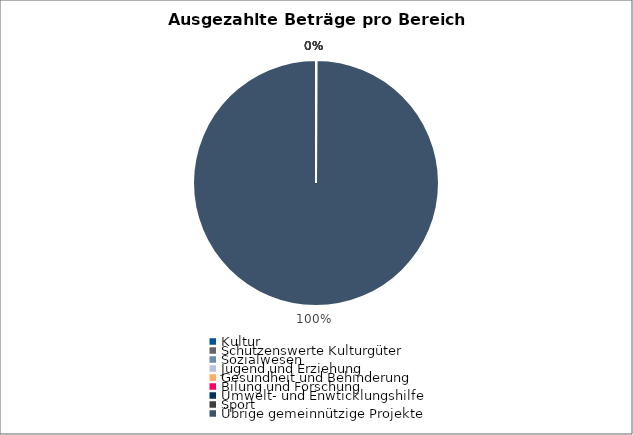
| Category | Series 0 |
|---|---|
| Kultur | 0 |
| Schützenswerte Kulturgüter | 0 |
| Sozialwesen | 0 |
| Jugend und Erziehung | 0 |
| Gesundheit und Behinderung | 0 |
| Bilung und Forschung | 0 |
| Umwelt- und Enwticklungshilfe | 0 |
| Sport | 0 |
| Übrige gemeinnützige Projekte | 26557 |